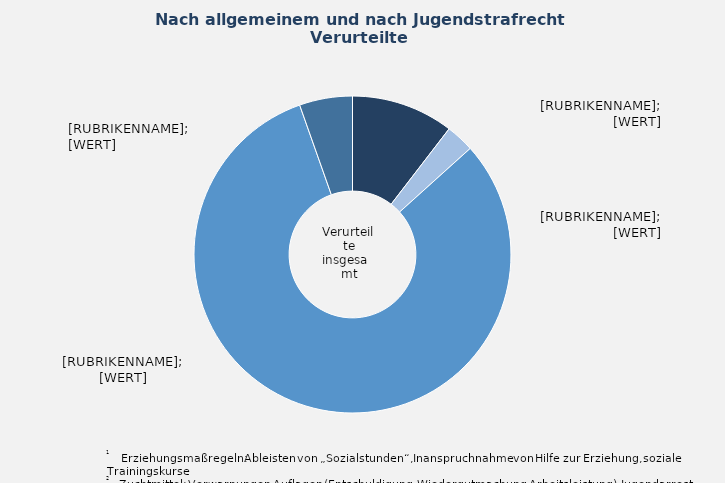
| Category | in Prozent |
|---|---|
| Freiheits- /Jugendstrafe mit Strafaussetzung zur Bewährung | 10.435 |
| Freiheits- /Jugendstrafe ohne Strafaussetzung zur Bewährung | 2.893 |
| Geldstrafe | 81.266 |
| Erziehungsmaßregeln¹, Zuchtmittel² | 5.407 |